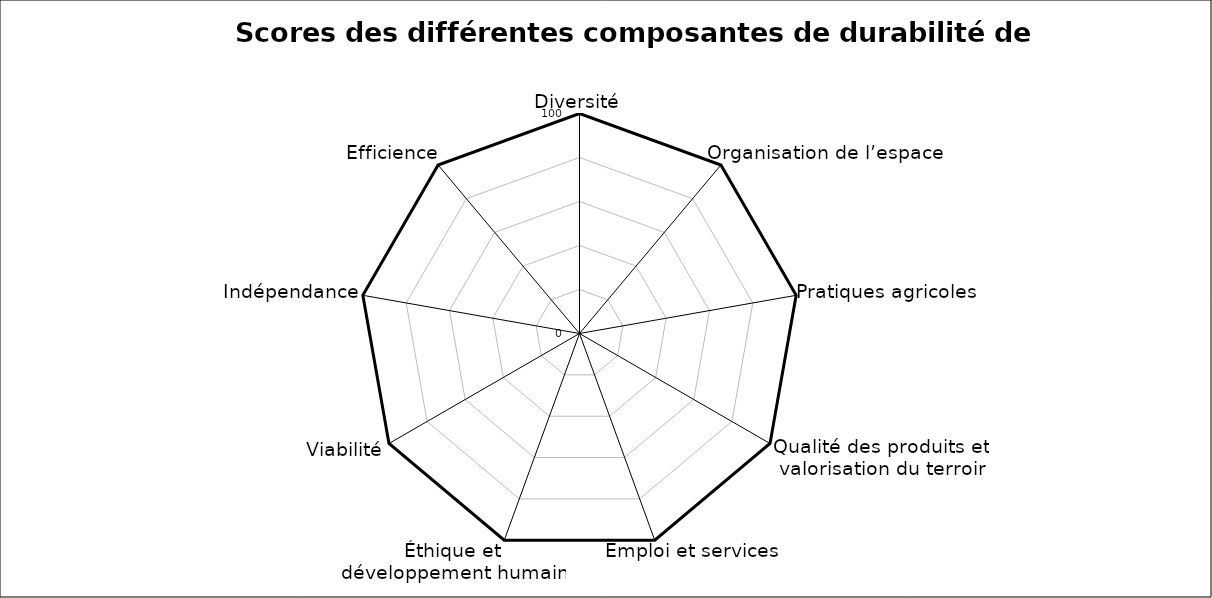
| Category | SI | Maximum |
|---|---|---|
| Diversité | 0 | 100 |
| Organisation de l’espace | 0 | 100 |
| Pratiques agricoles | 0 | 100 |
| Qualité des produits et valorisation du terroir | 0 | 100 |
| Emploi et services | 0 | 100 |
| Éthique et développement humain | 0 | 100 |
| Viabilité | 0 | 100 |
| Indépendance | 0 | 100 |
| Efficience | 0 | 100 |